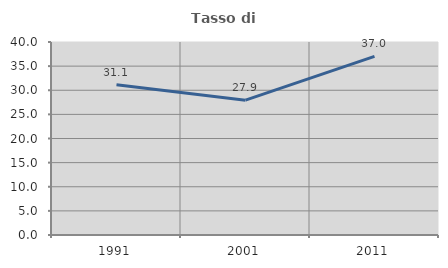
| Category | Tasso di occupazione   |
|---|---|
| 1991.0 | 31.13 |
| 2001.0 | 27.943 |
| 2011.0 | 37.027 |